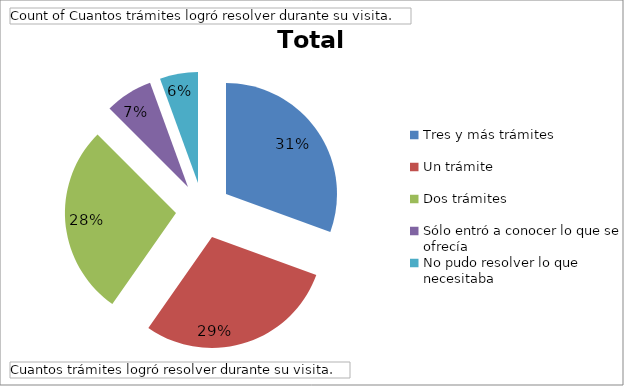
| Category | Total |
|---|---|
| Tres y más trámites | 66 |
| Un trámite | 63 |
| Dos trámites | 60 |
| Sólo entró a conocer lo que se ofrecía | 15 |
| No pudo resolver lo que necesitaba | 12 |